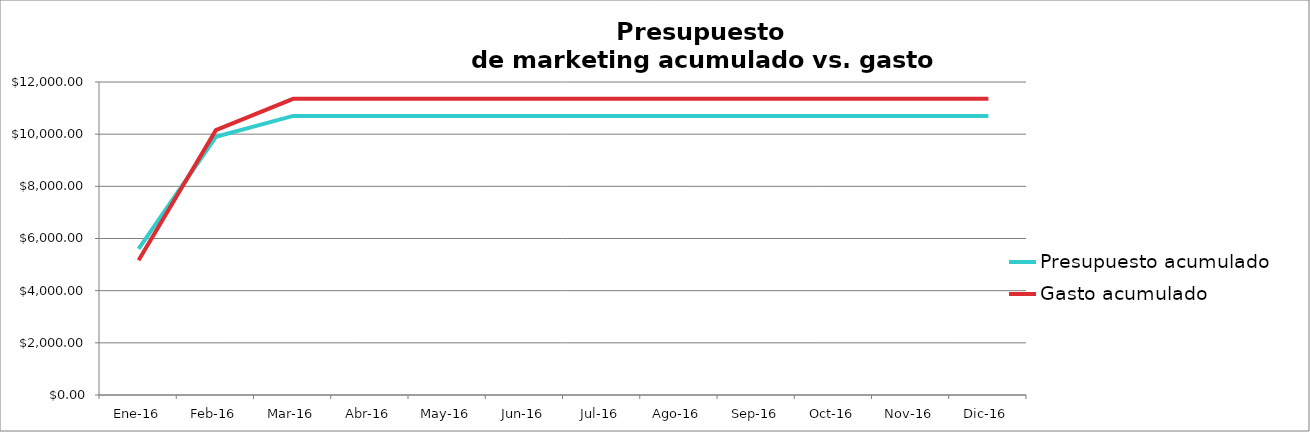
| Category | Presupuesto acumulado | Gasto acumulado |
|---|---|---|
| Ene-16 | 5600 | 5166 |
| Feb-16 | 9900 | 10155 |
| Mar-16 | 10700 | 11355 |
| Abr-16 | 10700 | 11355 |
| May-16 | 10700 | 11355 |
| Jun-16 | 10700 | 11355 |
| Jul-16 | 10700 | 11355 |
| Ago-16 | 10700 | 11355 |
| Sep-16 | 10700 | 11355 |
| Oct-16 | 10700 | 11355 |
| Nov-16 | 10700 | 11355 |
| Dic-16 | 10700 | 11355 |